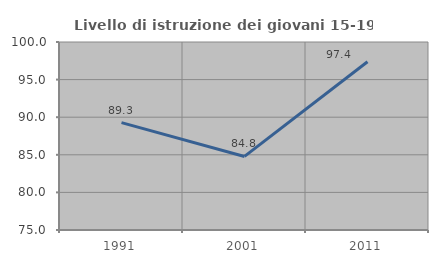
| Category | Livello di istruzione dei giovani 15-19 anni |
|---|---|
| 1991.0 | 89.286 |
| 2001.0 | 84.783 |
| 2011.0 | 97.368 |